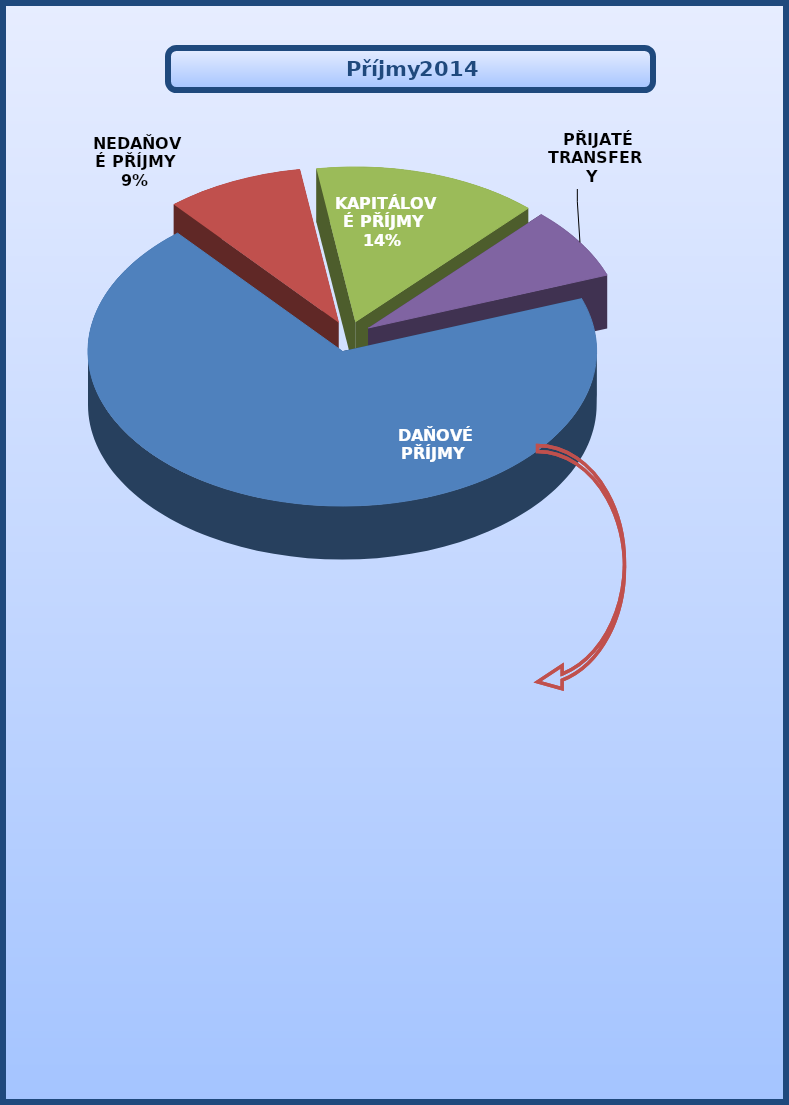
| Category | Příjmy 2014 |
|---|---|
|  DAŇOVÉ PŘÍJMY | 725520 |
|  NEDAŇOVÉ PŘÍJMY | 91795 |
|  KAPITÁLOVÉ PŘÍJMY | 150000 |
|  PŘIJATÉ TRANSFERY  | 79000 |